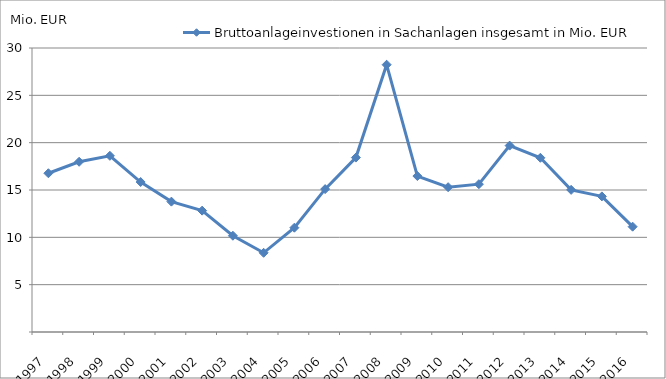
| Category | Bruttoanlageinvestionen in Sachanlagen insgesamt in Mio. EUR |
|---|---|
| 1997.0 | 16.771 |
| 1998.0 | 17.982 |
| 1999.0 | 18.612 |
| 2000.0 | 15.842 |
| 2001.0 | 13.772 |
| 2002.0 | 12.821 |
| 2003.0 | 10.169 |
| 2004.0 | 8.366 |
| 2005.0 | 11.018 |
| 2006.0 | 15.093 |
| 2007.0 | 18.424 |
| 2008.0 | 28.234 |
| 2009.0 | 16.475 |
| 2010.0 | 15.298 |
| 2011.0 | 15.615 |
| 2012.0 | 19.688 |
| 2013.0 | 18.402 |
| 2014.0 | 15.014 |
| 2015.0 | 14.325 |
| 2016.0 | 11.126 |